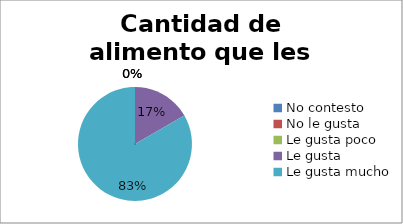
| Category | Series 0 |
|---|---|
| No contesto | 0 |
| No le gusta | 0 |
| Le gusta poco | 0 |
| Le gusta | 1 |
| Le gusta mucho | 5 |